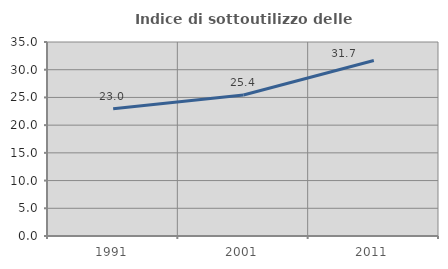
| Category | Indice di sottoutilizzo delle abitazioni  |
|---|---|
| 1991.0 | 22.95 |
| 2001.0 | 25.436 |
| 2011.0 | 31.657 |